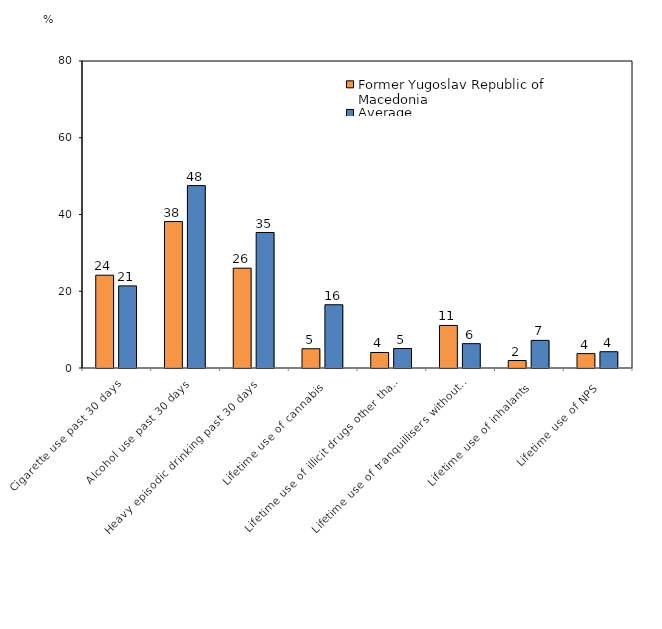
| Category | Former Yugoslav Republic of Macedonia | Average |
|---|---|---|
| Cigarette use past 30 days | 24.18 | 21.397 |
| Alcohol use past 30 days | 38.16 | 47.531 |
| Heavy episodic drinking past 30 days | 26.01 | 35.309 |
| Lifetime use of cannabis | 5.01 | 16.48 |
| Lifetime use of illicit drugs other than cannabis | 4.04 | 5.079 |
| Lifetime use of tranquillisers without prescription  | 11.09 | 6.34 |
| Lifetime use of inhalants | 1.95 | 7.202 |
| Lifetime use of NPS | 3.75 | 4.246 |